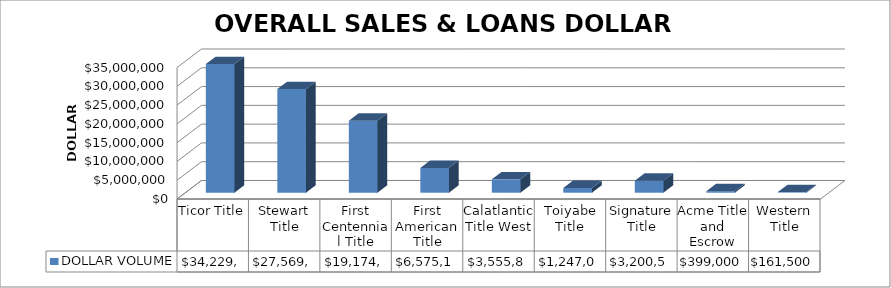
| Category | DOLLAR VOLUME |
|---|---|
| Ticor Title | 34229535 |
| Stewart Title | 27569279 |
| First Centennial Title | 19174119 |
| First American Title | 6575102 |
| Calatlantic Title West | 3555884 |
| Toiyabe Title | 1247000 |
| Signature Title | 3200513 |
| Acme Title and Escrow | 399000 |
| Western Title | 161500 |